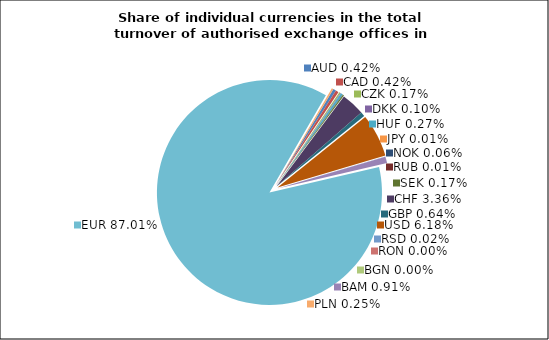
| Category | Series 0 |
|---|---|
| AUD | 0.417 |
| CAD | 0.417 |
| CZK | 0.169 |
| DKK | 0.102 |
| HUF | 0.272 |
| JPY | 0.005 |
| NOK | 0.06 |
| RUB | 0.006 |
| SEK | 0.169 |
| CHF | 3.362 |
| GBP | 0.64 |
| USD | 6.178 |
| RSD | 0.024 |
| RON | 0.001 |
| BGN | 0.001 |
| BAM | 0.912 |
| EUR | 87.011 |
| PLN | 0.254 |